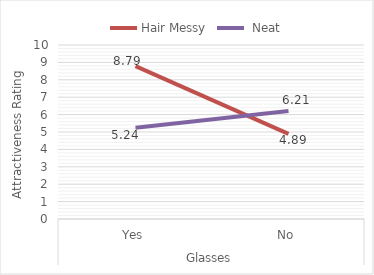
| Category | Hair |
|---|---|
| 0 | 5.24 |
| 1 | 6.21 |